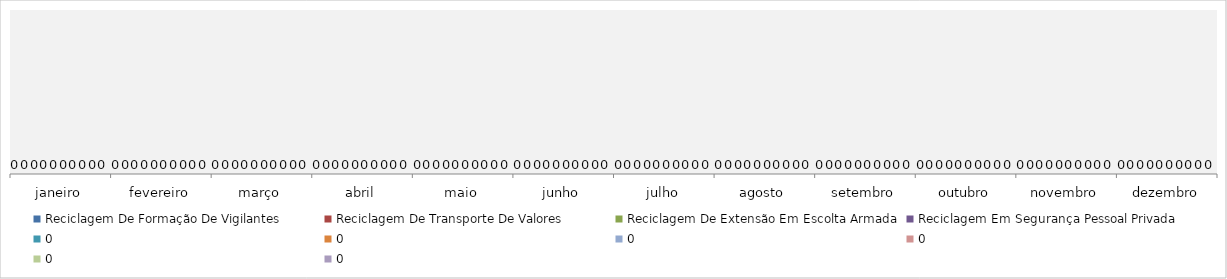
| Category | Reciclagem De Formação De Vigilantes | Reciclagem De Transporte De Valores | Reciclagem De Extensão Em Escolta Armada | Reciclagem Em Segurança Pessoal Privada | 0 |
|---|---|---|---|---|---|
| janeiro | 0 | 0 | 0 | 0 | 0 |
| fevereiro | 0 | 0 | 0 | 0 | 0 |
| março | 0 | 0 | 0 | 0 | 0 |
| abril | 0 | 0 | 0 | 0 | 0 |
| maio | 0 | 0 | 0 | 0 | 0 |
| junho | 0 | 0 | 0 | 0 | 0 |
| julho | 0 | 0 | 0 | 0 | 0 |
| agosto | 0 | 0 | 0 | 0 | 0 |
| setembro | 0 | 0 | 0 | 0 | 0 |
| outubro | 0 | 0 | 0 | 0 | 0 |
| novembro | 0 | 0 | 0 | 0 | 0 |
| dezembro | 0 | 0 | 0 | 0 | 0 |